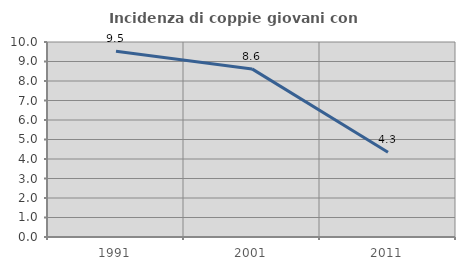
| Category | Incidenza di coppie giovani con figli |
|---|---|
| 1991.0 | 9.524 |
| 2001.0 | 8.621 |
| 2011.0 | 4.348 |